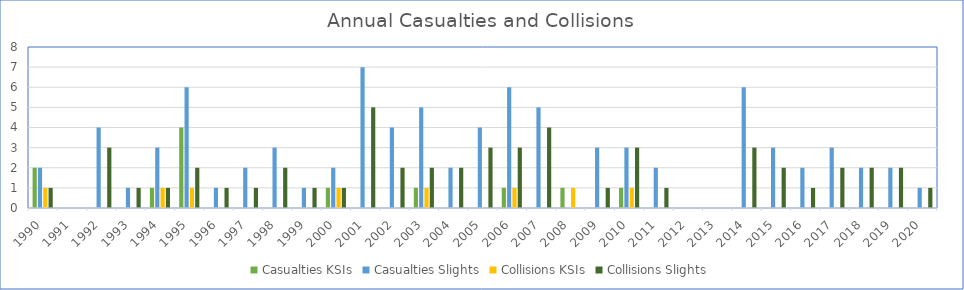
| Category | Casualties | Collisions |
|---|---|---|
| 1990.0 | 2 | 1 |
| 1991.0 | 0 | 0 |
| 1992.0 | 4 | 3 |
| 1993.0 | 1 | 1 |
| 1994.0 | 3 | 1 |
| 1995.0 | 6 | 2 |
| 1996.0 | 1 | 1 |
| 1997.0 | 2 | 1 |
| 1998.0 | 3 | 2 |
| 1999.0 | 1 | 1 |
| 2000.0 | 2 | 1 |
| 2001.0 | 7 | 5 |
| 2002.0 | 4 | 2 |
| 2003.0 | 5 | 2 |
| 2004.0 | 2 | 2 |
| 2005.0 | 4 | 3 |
| 2006.0 | 6 | 3 |
| 2007.0 | 5 | 4 |
| 2008.0 | 0 | 0 |
| 2009.0 | 3 | 1 |
| 2010.0 | 3 | 3 |
| 2011.0 | 2 | 1 |
| 2012.0 | 0 | 0 |
| 2013.0 | 0 | 0 |
| 2014.0 | 6 | 3 |
| 2015.0 | 3 | 2 |
| 2016.0 | 2 | 1 |
| 2017.0 | 3 | 2 |
| 2018.0 | 2 | 2 |
| 2019.0 | 2 | 2 |
| 2020.0 | 1 | 1 |